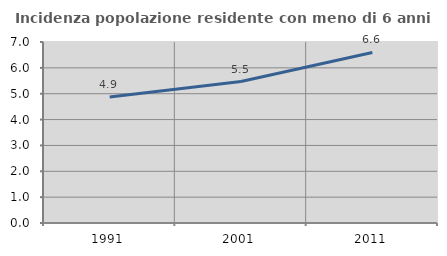
| Category | Incidenza popolazione residente con meno di 6 anni |
|---|---|
| 1991.0 | 4.873 |
| 2001.0 | 5.47 |
| 2011.0 | 6.597 |